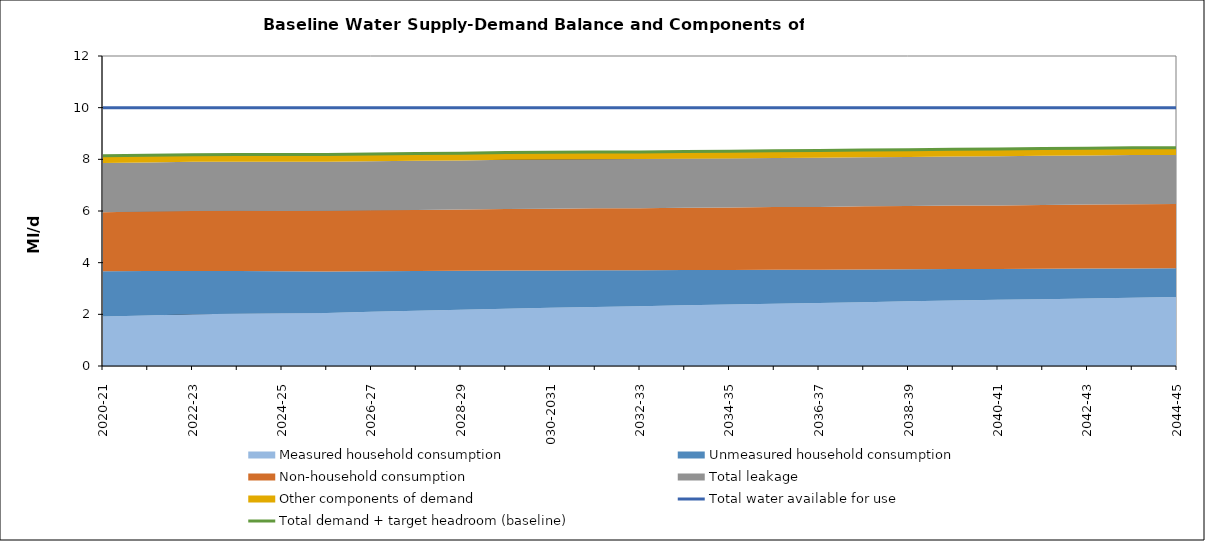
| Category | Total water available for use | Total demand + target headroom (baseline) |
|---|---|---|
| 0 | 10 | 8.134 |
| 1 | 10 | 8.158 |
| 2 | 10 | 8.181 |
| 3 | 10 | 8.186 |
| 4 | 10 | 8.184 |
| 5 | 10 | 8.186 |
| 6 | 10 | 8.205 |
| 7 | 10 | 8.222 |
| 8 | 10 | 8.236 |
| 9 | 10 | 8.261 |
| 10 | 10 | 8.271 |
| 11 | 10 | 8.284 |
| 12 | 10 | 8.288 |
| 13 | 10 | 8.306 |
| 14 | 10 | 8.316 |
| 15 | 10 | 8.331 |
| 16 | 10 | 8.338 |
| 17 | 10 | 8.361 |
| 18 | 10 | 8.374 |
| 19 | 10 | 8.388 |
| 20 | 10 | 8.396 |
| 21 | 10 | 8.416 |
| 22 | 10 | 8.43 |
| 23 | 10 | 8.444 |
| 24 | 10 | 8.452 |